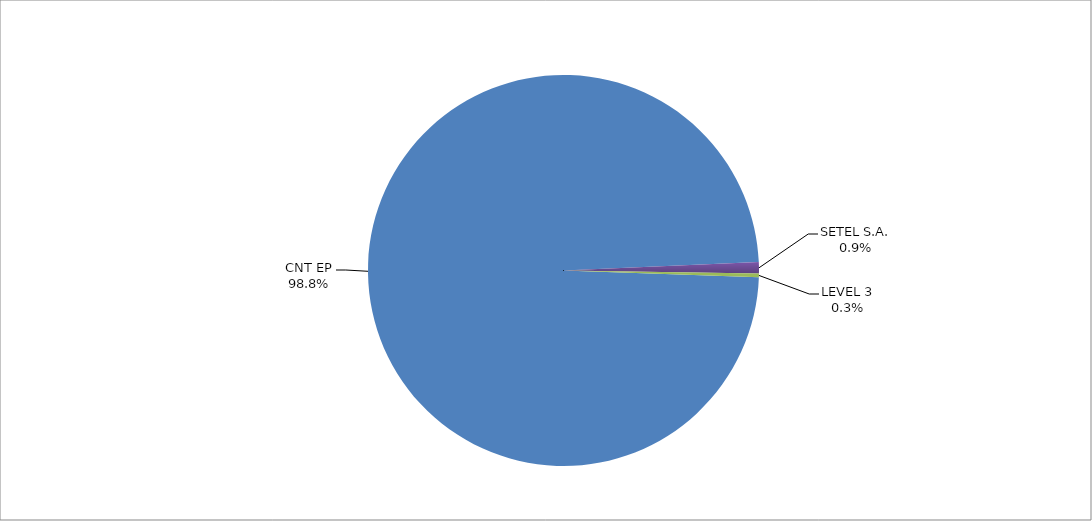
| Category | Series 0 |
|---|---|
| CNT EP | 319 |
| SETEL S.A. | 3 |
| LEVEL 3 | 1 |